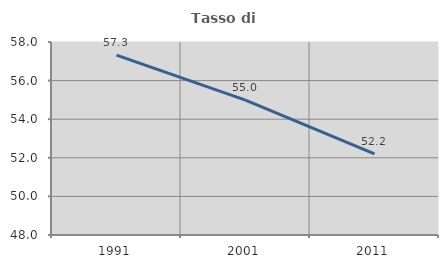
| Category | Tasso di occupazione   |
|---|---|
| 1991.0 | 57.318 |
| 2001.0 | 54.986 |
| 2011.0 | 52.203 |